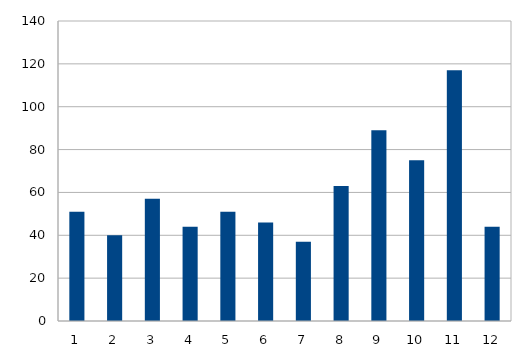
| Category | Series 0 |
|---|---|
| 0 | 51 |
| 1 | 40 |
| 2 | 57 |
| 3 | 44 |
| 4 | 51 |
| 5 | 46 |
| 6 | 37 |
| 7 | 63 |
| 8 | 89 |
| 9 | 75 |
| 10 | 117 |
| 11 | 44 |